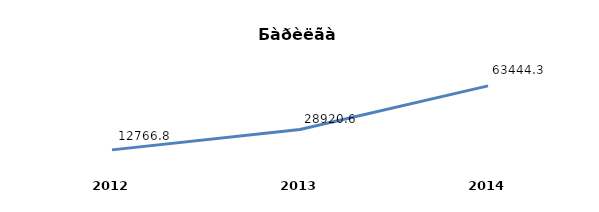
| Category | áàðèëãà óãñðàëò |
|---|---|
| 2012.0 | 12766.8 |
| 2013.0 | 28920.6 |
| 2014.0 | 63444.3 |